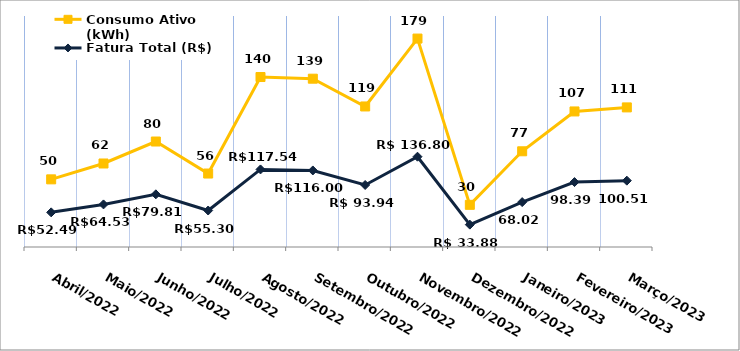
| Category | Fatura Total (R$) | Consumo Ativo (kWh) |
|---|---|---|
| Abril/2022 | 52.49 | 50 |
| Maio/2022 | 64.53 | 62 |
| Junho/2022 | 79.81 | 80 |
| Julho/2022 | 55.3 | 56 |
| Agosto/2022 | 117.54 | 140 |
| Setembro/2022 | 116 | 139 |
| Outubro/2022 | 93.94 | 119 |
| Novembro/2022 | 136.8 | 179 |
| Dezembro/2022 | 33.88 | 30 |
| Janeiro/2023 | 68.02 | 77 |
| Fevereiro/2023 | 98.39 | 107 |
| Março/2023 | 100.51 | 111 |